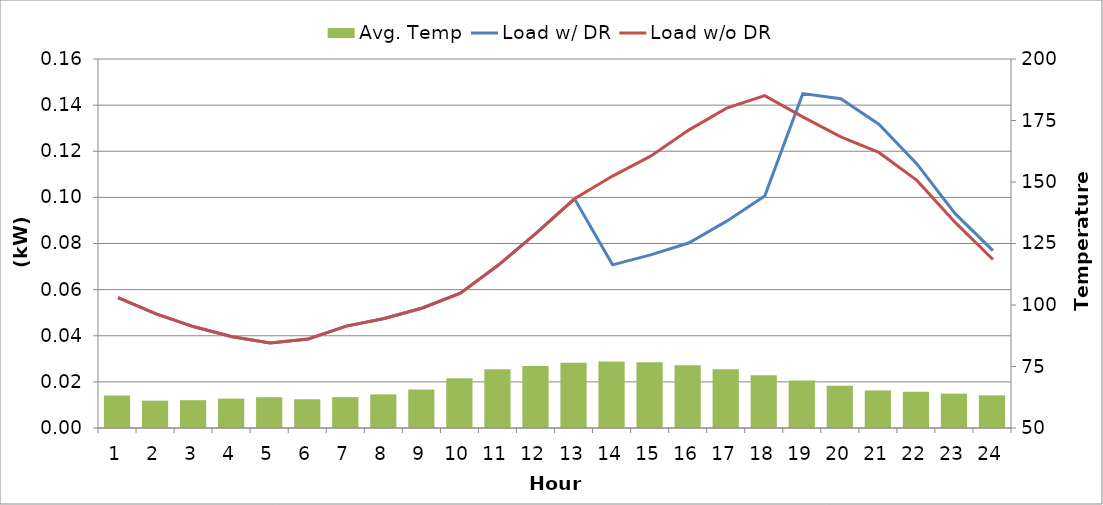
| Category | Avg. Temp |
|---|---|
| 0 | 63.215 |
| 1 | 61.117 |
| 2 | 61.31 |
| 3 | 61.953 |
| 4 | 62.506 |
| 5 | 61.688 |
| 6 | 62.534 |
| 7 | 63.672 |
| 8 | 65.649 |
| 9 | 70.224 |
| 10 | 73.92 |
| 11 | 75.214 |
| 12 | 76.536 |
| 13 | 77.071 |
| 14 | 76.687 |
| 15 | 75.464 |
| 16 | 73.897 |
| 17 | 71.409 |
| 18 | 69.278 |
| 19 | 67.224 |
| 20 | 65.24 |
| 21 | 64.721 |
| 22 | 63.967 |
| 23 | 63.276 |